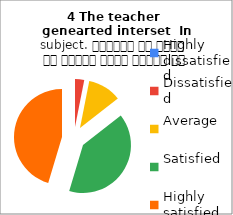
| Category | 4 The teacher 
genearted interset  In subject. शिक्षक ने विषय के प्रति रुचि जागृत की |
|---|---|
| Highly dissatisfied | 0 |
| Dissatisfied | 3 |
| Average | 11 |
| Satisfied | 39 |
| Highly satisfied | 44 |